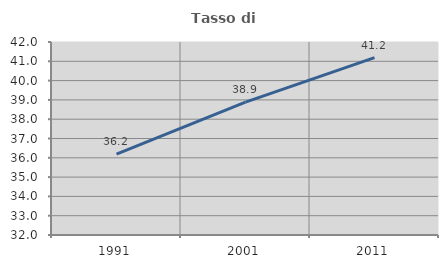
| Category | Tasso di occupazione   |
|---|---|
| 1991.0 | 36.192 |
| 2001.0 | 38.884 |
| 2011.0 | 41.189 |